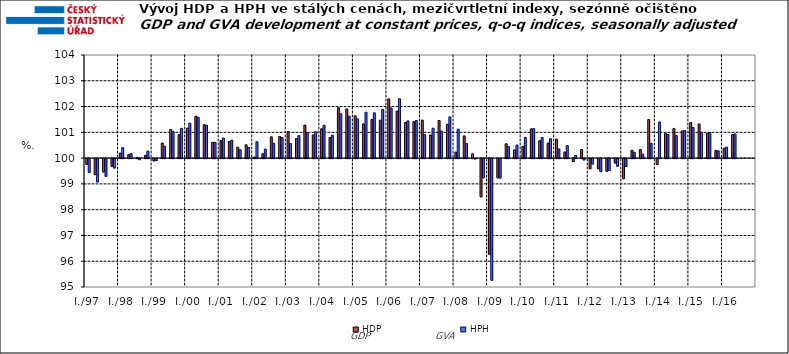
| Category | HDP

 | HPH

 |
|---|---|---|
| I./97 | 99.777 | 99.464 |
|  | 99.379 | 99.092 |
|  | 99.485 | 99.31 |
|  | 99.703 | 99.636 |
| I./98 | 100.194 | 100.406 |
|  | 100.133 | 100.173 |
|  | 100.033 | 99.958 |
|  | 100.107 | 100.271 |
| I./99 | 99.911 | 99.927 |
|  | 100.584 | 100.459 |
|  | 101.11 | 101.036 |
|  | 100.911 | 101.155 |
| I./00 | 101.165 | 101.358 |
|  | 101.626 | 101.58 |
|  | 101.295 | 101.277 |
|  | 100.611 | 100.614 |
| I./01 | 100.68 | 100.781 |
|  | 100.641 | 100.696 |
|  | 100.425 | 100.322 |
|  | 100.516 | 100.415 |
| I./02 | 100.042 | 100.634 |
|  | 100.166 | 100.353 |
|  | 100.826 | 100.573 |
|  | 100.841 | 100.795 |
| I./03 | 101.033 | 100.56 |
|  | 100.757 | 100.872 |
|  | 101.281 | 100.995 |
|  | 100.896 | 101.022 |
| I./04 | 101.137 | 101.274 |
|  | 100.805 | 100.886 |
|  | 101.955 | 101.717 |
|  | 101.909 | 101.627 |
| I./05 | 101.641 | 101.521 |
|  | 101.328 | 101.781 |
|  | 101.5 | 101.758 |
|  | 101.471 | 101.89 |
| I./06 | 102.296 | 101.947 |
|  | 101.825 | 102.303 |
|  | 101.38 | 101.444 |
|  | 101.411 | 101.463 |
| I./07 | 101.475 | 100.909 |
|  | 100.895 | 101.161 |
|  | 101.461 | 101.051 |
|  | 101.31 | 101.599 |
| I./08 | 100.233 | 101.122 |
|  | 100.863 | 100.563 |
|  | 100.164 | 99.983 |
|  | 98.517 | 99.255 |
| I./09 | 96.289 | 95.282 |
|  | 99.257 | 99.246 |
|  | 100.555 | 100.447 |
|  | 100.321 | 100.508 |
| I./10 | 100.452 | 100.804 |
|  | 101.136 | 101.142 |
|  | 100.675 | 100.801 |
|  | 100.584 | 100.752 |
| I./11 | 100.736 | 100.356 |
|  | 100.239 | 100.487 |
|  | 99.885 | 100.106 |
|  | 100.333 | 99.948 |
| I./12 | 99.607 | 99.789 |
|  | 99.61 | 99.497 |
|  | 99.51 | 99.539 |
|  | 99.83 | 99.703 |
| I./13 | 99.22 | 99.696 |
|  | 100.304 | 100.225 |
|  | 100.331 | 100.159 |
|  | 101.496 | 100.573 |
| I./14 | 99.776 | 101.401 |
|  | 100.952 | 100.914 |
|  | 101.152 | 100.877 |
|  | 101.055 | 101.069 |
| I./15 | 101.383 | 101.195 |
|  | 101.324 | 100.999 |
|  | 100.969 | 100.99 |
|  | 100.295 | 100.283 |
| I./16 | 100.388 | 100.427 |